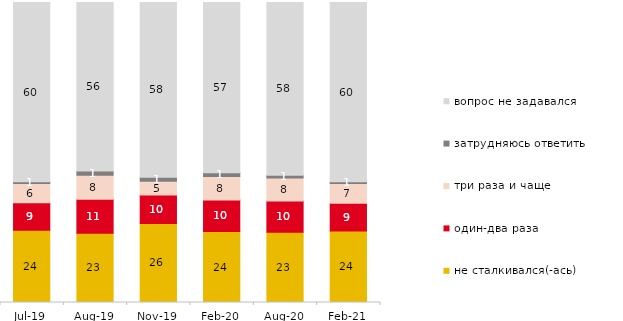
| Category | не сталкивался(-ась) | один-два раза | три раза и чаще | затрудняюсь ответить | вопрос не задавался |
|---|---|---|---|---|---|
| 2019-07-01 | 24.059 | 9.208 | 6.386 | 0.594 | 59.752 |
| 2019-08-01 | 23.077 | 11.339 | 8.042 | 1.399 | 56.144 |
| 2019-11-01 | 26.337 | 9.505 | 4.604 | 1.337 | 58.218 |
| 2020-02-01 | 23.663 | 10.495 | 7.871 | 1.188 | 56.782 |
| 2020-08-01 | 23.436 | 10.377 | 7.696 | 0.894 | 57.597 |
| 2021-02-01 | 23.821 | 9.231 | 6.6 | 0.596 | 59.752 |